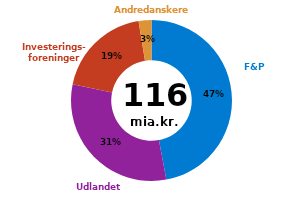
| Category | Sum af Nettotrans |
|---|---|
| F&P inkl. faamands | 54.4 |
| Udlandet | 36.031 |
| Investeringsforeninger | 22.216 |
| Andre danskere | 2.978 |